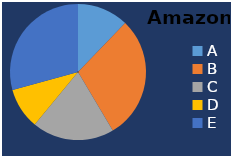
| Category | Amazon |
|---|---|
| A | 25 |
| B | 60 |
| C | 40 |
| D | 20 |
| E | 60 |